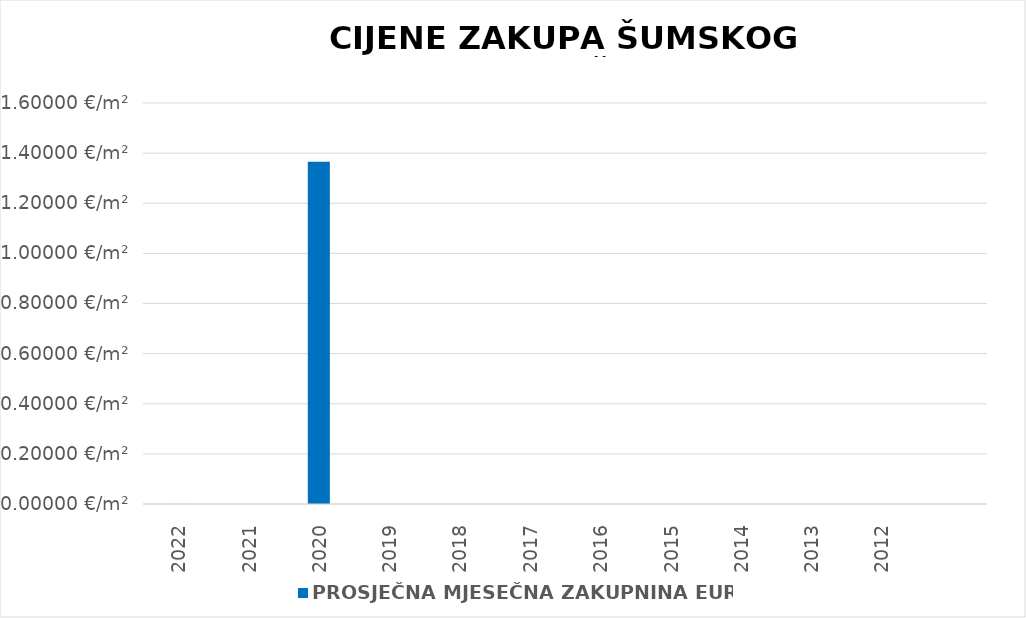
| Category | PROSJEČNA MJESEČNA ZAKUPNINA EUR/m2 |
|---|---|
| 2022 | 0 |
| 2021 | 0 |
| 2020 | 1900-01-01 08:45:52 |
| 2019 | 0 |
| 2018 | 0 |
| 2017 | 0 |
| 2016 | 0 |
| 2015 | 0 |
| 2014 | 0 |
| 2013 | 0 |
| 2012 | 0 |